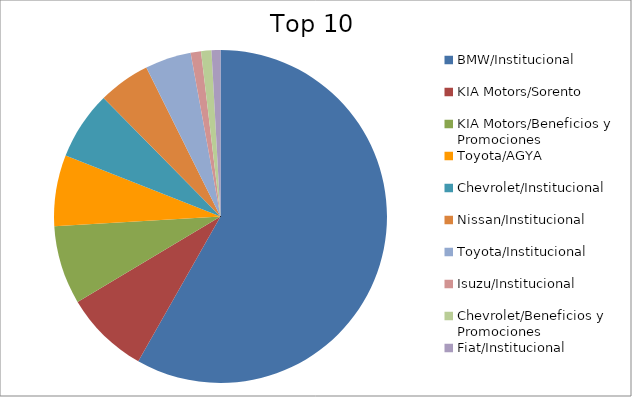
| Category | Series 0 |
|---|---|
| BMW/Institucional | 56.66 |
| KIA Motors/Sorento | 7.99 |
| KIA Motors/Beneficios y Promociones | 7.43 |
| Toyota/AGYA | 6.73 |
| Chevrolet/Institucional | 6.45 |
| Nissan/Institucional | 4.91 |
| Toyota/Institucional | 4.35 |
| Isuzu/Institucional | 0.98 |
| Chevrolet/Beneficios y Promociones | 0.98 |
| Fiat/Institucional | 0.84 |